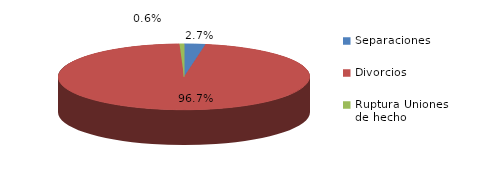
| Category | Series 0 |
|---|---|
| Separaciones | 19 |
| Divorcios | 677 |
| Ruptura Uniones de hecho | 4 |